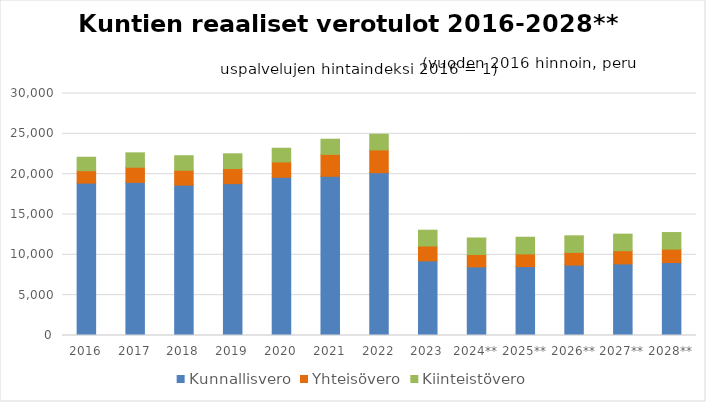
| Category | Kunnallisvero | Yhteisövero | Kiinteistövero |
|---|---|---|---|
| 2016 | 18890.563 | 1537.872 | 1669.703 |
| 2017 | 18984.903 | 1876.821 | 1781.79 |
| 2018 | 18637.434 | 1845.137 | 1801.77 |
| 2019 | 18825.284 | 1868.046 | 1830.346 |
| 2020 | 19613.622 | 1907.626 | 1694.608 |
| 2021 | 19729.802 | 2724.595 | 1879.564 |
| 2022 | 20180.604 | 2827.179 | 1944.423 |
| 2023 | 9250.068 | 1845.508 | 1957.788 |
| 2024** | 8504.624 | 1535.067 | 2046.756 |
| 2025** | 8544.272 | 1572.353 | 2064.794 |
| 2026** | 8722.633 | 1580.555 | 2053.876 |
| 2027** | 8873.27 | 1638.906 | 2052.772 |
| 2028** | 9045.586 | 1659.442 | 2058.034 |